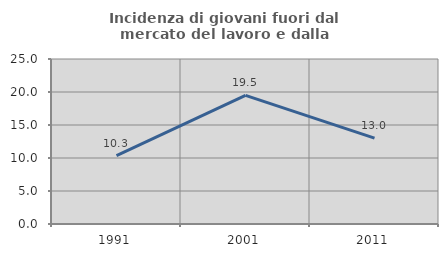
| Category | Incidenza di giovani fuori dal mercato del lavoro e dalla formazione  |
|---|---|
| 1991.0 | 10.348 |
| 2001.0 | 19.498 |
| 2011.0 | 13.006 |